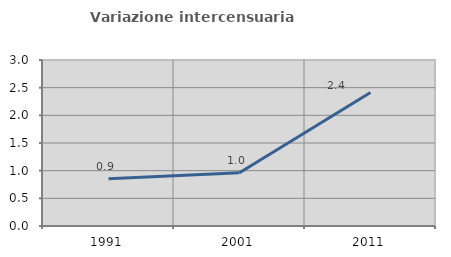
| Category | Variazione intercensuaria annua |
|---|---|
| 1991.0 | 0.855 |
| 2001.0 | 0.964 |
| 2011.0 | 2.412 |